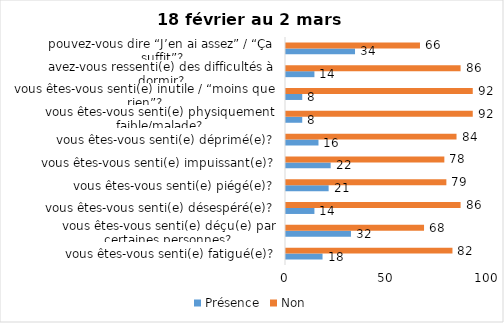
| Category | Présence | Non |
|---|---|---|
| vous êtes-vous senti(e) fatigué(e)? | 18 | 82 |
| vous êtes-vous senti(e) déçu(e) par certaines personnes? | 32 | 68 |
| vous êtes-vous senti(e) désespéré(e)? | 14 | 86 |
| vous êtes-vous senti(e) piégé(e)? | 21 | 79 |
| vous êtes-vous senti(e) impuissant(e)? | 22 | 78 |
| vous êtes-vous senti(e) déprimé(e)? | 16 | 84 |
| vous êtes-vous senti(e) physiquement faible/malade? | 8 | 92 |
| vous êtes-vous senti(e) inutile / “moins que rien”? | 8 | 92 |
| avez-vous ressenti(e) des difficultés à dormir? | 14 | 86 |
| pouvez-vous dire “J’en ai assez” / “Ça suffit”? | 34 | 66 |